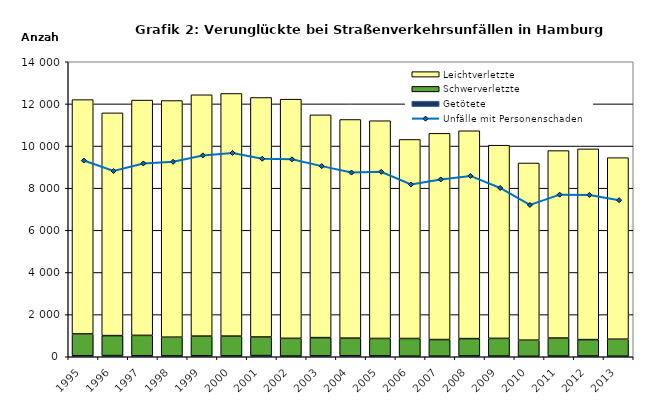
| Category | Getötete | Schwerverletzte | Leichtverletzte |
|---|---|---|---|
| 1995.0 | 46 | 1038 | 11120 |
| 1996.0 | 57 | 946 | 10571 |
| 1997.0 | 46 | 969 | 11166 |
| 1998.0 | 42 | 887 | 11230 |
| 1999.0 | 47 | 933 | 11453 |
| 2000.0 | 41 | 939 | 11515 |
| 2001.0 | 56 | 882 | 11366 |
| 2002.0 | 34 | 841 | 11350 |
| 2003.0 | 44 | 864 | 10573 |
| 2004.0 | 48 | 836 | 10376 |
| 2005.0 | 43 | 826 | 10332 |
| 2006.0 | 28 | 839 | 9446 |
| 2007.0 | 30 | 787 | 9786 |
| 2008.0 | 40 | 821 | 9864 |
| 2009.0 | 33 | 840 | 9167 |
| 2010.0 | 22 | 765 | 8408 |
| 2011.0 | 34 | 853 | 8897 |
| 2012.0 | 33 | 781 | 9051 |
| 2013.0 | 26 | 808 | 8615 |